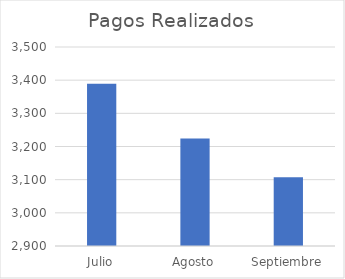
| Category | Pagos Realizados |
|---|---|
| Julio | 3389 |
| Agosto | 3224 |
| Septiembre | 3107 |